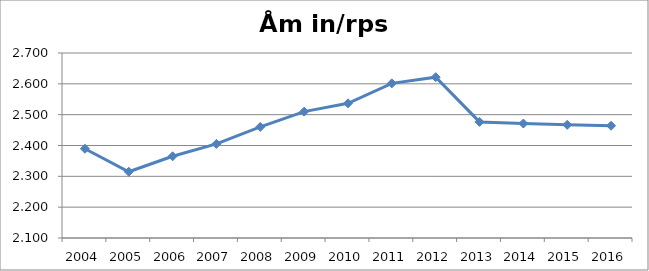
| Category | Åm in/rps ut |
|---|---|
| 2004.0 | 2.389 |
| 2005.0 | 2.315 |
| 2006.0 | 2.365 |
| 2007.0 | 2.405 |
| 2008.0 | 2.46 |
| 2009.0 | 2.51 |
| 2010.0 | 2.537 |
| 2011.0 | 2.602 |
| 2012.0 | 2.622 |
| 2013.0 | 2.477 |
| 2014.0 | 2.471 |
| 2015.0 | 2.467 |
| 2016.0 | 2.464 |